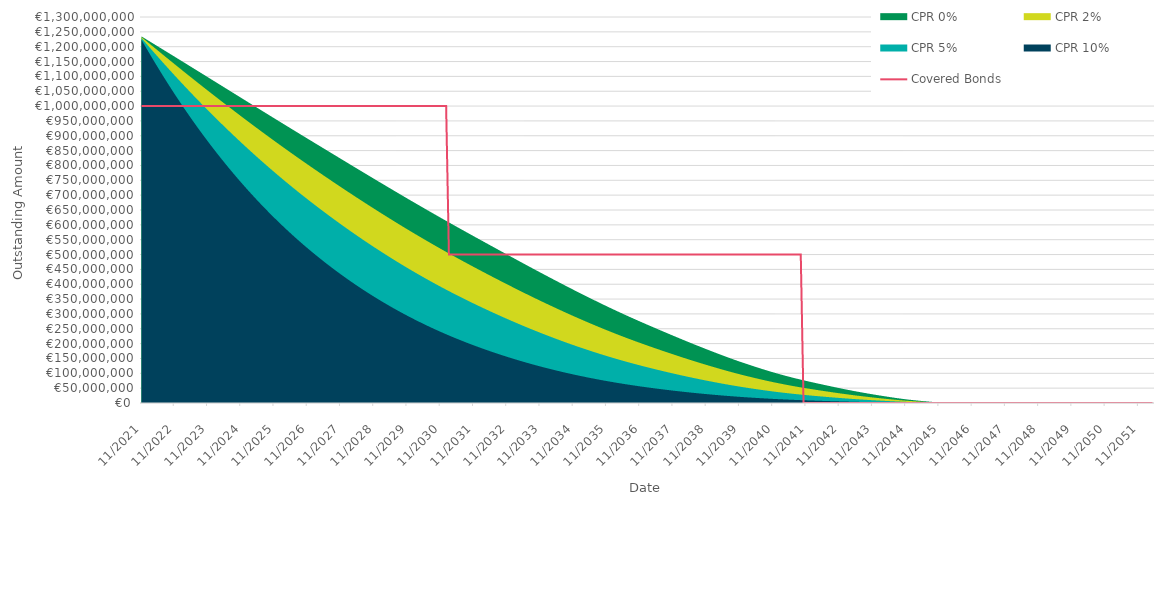
| Category | Covered Bonds |
|---|---|
| 2021-11-30 | 1000000000 |
| 2021-12-31 | 1000000000 |
| 2022-01-31 | 1000000000 |
| 2022-02-28 | 1000000000 |
| 2022-03-31 | 1000000000 |
| 2022-04-30 | 1000000000 |
| 2022-05-31 | 1000000000 |
| 2022-06-30 | 1000000000 |
| 2022-07-31 | 1000000000 |
| 2022-08-31 | 1000000000 |
| 2022-09-30 | 1000000000 |
| 2022-10-31 | 1000000000 |
| 2022-11-30 | 1000000000 |
| 2022-12-31 | 1000000000 |
| 2023-01-31 | 1000000000 |
| 2023-02-28 | 1000000000 |
| 2023-03-31 | 1000000000 |
| 2023-04-30 | 1000000000 |
| 2023-05-31 | 1000000000 |
| 2023-06-30 | 1000000000 |
| 2023-07-31 | 1000000000 |
| 2023-08-31 | 1000000000 |
| 2023-09-30 | 1000000000 |
| 2023-10-31 | 1000000000 |
| 2023-11-30 | 1000000000 |
| 2023-12-31 | 1000000000 |
| 2024-01-31 | 1000000000 |
| 2024-02-29 | 1000000000 |
| 2024-03-31 | 1000000000 |
| 2024-04-30 | 1000000000 |
| 2024-05-31 | 1000000000 |
| 2024-06-30 | 1000000000 |
| 2024-07-31 | 1000000000 |
| 2024-08-31 | 1000000000 |
| 2024-09-30 | 1000000000 |
| 2024-10-31 | 1000000000 |
| 2024-11-30 | 1000000000 |
| 2024-12-31 | 1000000000 |
| 2025-01-31 | 1000000000 |
| 2025-02-28 | 1000000000 |
| 2025-03-31 | 1000000000 |
| 2025-04-30 | 1000000000 |
| 2025-05-31 | 1000000000 |
| 2025-06-30 | 1000000000 |
| 2025-07-31 | 1000000000 |
| 2025-08-31 | 1000000000 |
| 2025-09-30 | 1000000000 |
| 2025-10-31 | 1000000000 |
| 2025-11-30 | 1000000000 |
| 2025-12-31 | 1000000000 |
| 2026-01-31 | 1000000000 |
| 2026-02-28 | 1000000000 |
| 2026-03-31 | 1000000000 |
| 2026-04-30 | 1000000000 |
| 2026-05-31 | 1000000000 |
| 2026-06-30 | 1000000000 |
| 2026-07-31 | 1000000000 |
| 2026-08-31 | 1000000000 |
| 2026-09-30 | 1000000000 |
| 2026-10-31 | 1000000000 |
| 2026-11-30 | 1000000000 |
| 2026-12-31 | 1000000000 |
| 2027-01-31 | 1000000000 |
| 2027-02-28 | 1000000000 |
| 2027-03-31 | 1000000000 |
| 2027-04-30 | 1000000000 |
| 2027-05-31 | 1000000000 |
| 2027-06-30 | 1000000000 |
| 2027-07-31 | 1000000000 |
| 2027-08-31 | 1000000000 |
| 2027-09-30 | 1000000000 |
| 2027-10-31 | 1000000000 |
| 2027-11-30 | 1000000000 |
| 2027-12-31 | 1000000000 |
| 2028-01-31 | 1000000000 |
| 2028-02-29 | 1000000000 |
| 2028-03-31 | 1000000000 |
| 2028-04-30 | 1000000000 |
| 2028-05-31 | 1000000000 |
| 2028-06-30 | 1000000000 |
| 2028-07-31 | 1000000000 |
| 2028-08-31 | 1000000000 |
| 2028-09-30 | 1000000000 |
| 2028-10-31 | 1000000000 |
| 2028-11-30 | 1000000000 |
| 2028-12-31 | 1000000000 |
| 2029-01-31 | 1000000000 |
| 2029-02-28 | 1000000000 |
| 2029-03-31 | 1000000000 |
| 2029-04-30 | 1000000000 |
| 2029-05-31 | 1000000000 |
| 2029-06-30 | 1000000000 |
| 2029-07-31 | 1000000000 |
| 2029-08-31 | 1000000000 |
| 2029-09-30 | 1000000000 |
| 2029-10-31 | 1000000000 |
| 2029-11-30 | 1000000000 |
| 2029-12-31 | 1000000000 |
| 2030-01-31 | 1000000000 |
| 2030-02-28 | 1000000000 |
| 2030-03-31 | 1000000000 |
| 2030-04-30 | 1000000000 |
| 2030-05-31 | 1000000000 |
| 2030-06-30 | 1000000000 |
| 2030-07-31 | 1000000000 |
| 2030-08-31 | 1000000000 |
| 2030-09-30 | 1000000000 |
| 2030-10-31 | 1000000000 |
| 2030-11-30 | 1000000000 |
| 2030-12-31 | 1000000000 |
| 2031-01-31 | 1000000000 |
| 2031-02-28 | 500000000 |
| 2031-03-31 | 500000000 |
| 2031-04-30 | 500000000 |
| 2031-05-31 | 500000000 |
| 2031-06-30 | 500000000 |
| 2031-07-31 | 500000000 |
| 2031-08-31 | 500000000 |
| 2031-09-30 | 500000000 |
| 2031-10-31 | 500000000 |
| 2031-11-30 | 500000000 |
| 2031-12-31 | 500000000 |
| 2032-01-31 | 500000000 |
| 2032-02-29 | 500000000 |
| 2032-03-31 | 500000000 |
| 2032-04-30 | 500000000 |
| 2032-05-31 | 500000000 |
| 2032-06-30 | 500000000 |
| 2032-07-31 | 500000000 |
| 2032-08-31 | 500000000 |
| 2032-09-30 | 500000000 |
| 2032-10-31 | 500000000 |
| 2032-11-30 | 500000000 |
| 2032-12-31 | 500000000 |
| 2033-01-31 | 500000000 |
| 2033-02-28 | 500000000 |
| 2033-03-31 | 500000000 |
| 2033-04-30 | 500000000 |
| 2033-05-31 | 500000000 |
| 2033-06-30 | 500000000 |
| 2033-07-31 | 500000000 |
| 2033-08-31 | 500000000 |
| 2033-09-30 | 500000000 |
| 2033-10-31 | 500000000 |
| 2033-11-30 | 500000000 |
| 2033-12-31 | 500000000 |
| 2034-01-31 | 500000000 |
| 2034-02-28 | 500000000 |
| 2034-03-31 | 500000000 |
| 2034-04-30 | 500000000 |
| 2034-05-31 | 500000000 |
| 2034-06-30 | 500000000 |
| 2034-07-31 | 500000000 |
| 2034-08-31 | 500000000 |
| 2034-09-30 | 500000000 |
| 2034-10-31 | 500000000 |
| 2034-11-30 | 500000000 |
| 2034-12-31 | 500000000 |
| 2035-01-31 | 500000000 |
| 2035-02-28 | 500000000 |
| 2035-03-31 | 500000000 |
| 2035-04-30 | 500000000 |
| 2035-05-31 | 500000000 |
| 2035-06-30 | 500000000 |
| 2035-07-31 | 500000000 |
| 2035-08-31 | 500000000 |
| 2035-09-30 | 500000000 |
| 2035-10-31 | 500000000 |
| 2035-11-30 | 500000000 |
| 2035-12-31 | 500000000 |
| 2036-01-31 | 500000000 |
| 2036-02-29 | 500000000 |
| 2036-03-31 | 500000000 |
| 2036-04-30 | 500000000 |
| 2036-05-31 | 500000000 |
| 2036-06-30 | 500000000 |
| 2036-07-31 | 500000000 |
| 2036-08-31 | 500000000 |
| 2036-09-30 | 500000000 |
| 2036-10-31 | 500000000 |
| 2036-11-30 | 500000000 |
| 2036-12-31 | 500000000 |
| 2037-01-31 | 500000000 |
| 2037-02-28 | 500000000 |
| 2037-03-31 | 500000000 |
| 2037-04-30 | 500000000 |
| 2037-05-31 | 500000000 |
| 2037-06-30 | 500000000 |
| 2037-07-31 | 500000000 |
| 2037-08-31 | 500000000 |
| 2037-09-30 | 500000000 |
| 2037-10-31 | 500000000 |
| 2037-11-30 | 500000000 |
| 2037-12-31 | 500000000 |
| 2038-01-31 | 500000000 |
| 2038-02-28 | 500000000 |
| 2038-03-31 | 500000000 |
| 2038-04-30 | 500000000 |
| 2038-05-31 | 500000000 |
| 2038-06-30 | 500000000 |
| 2038-07-31 | 500000000 |
| 2038-08-31 | 500000000 |
| 2038-09-30 | 500000000 |
| 2038-10-31 | 500000000 |
| 2038-11-30 | 500000000 |
| 2038-12-31 | 500000000 |
| 2039-01-31 | 500000000 |
| 2039-02-28 | 500000000 |
| 2039-03-31 | 500000000 |
| 2039-04-30 | 500000000 |
| 2039-05-31 | 500000000 |
| 2039-06-30 | 500000000 |
| 2039-07-31 | 500000000 |
| 2039-08-31 | 500000000 |
| 2039-09-30 | 500000000 |
| 2039-10-31 | 500000000 |
| 2039-11-30 | 500000000 |
| 2039-12-31 | 500000000 |
| 2040-01-31 | 500000000 |
| 2040-02-29 | 500000000 |
| 2040-03-31 | 500000000 |
| 2040-04-30 | 500000000 |
| 2040-05-31 | 500000000 |
| 2040-06-30 | 500000000 |
| 2040-07-31 | 500000000 |
| 2040-08-31 | 500000000 |
| 2040-09-30 | 500000000 |
| 2040-10-31 | 500000000 |
| 2040-11-30 | 500000000 |
| 2040-12-31 | 500000000 |
| 2041-01-31 | 500000000 |
| 2041-02-28 | 500000000 |
| 2041-03-31 | 500000000 |
| 2041-04-30 | 500000000 |
| 2041-05-31 | 500000000 |
| 2041-06-30 | 500000000 |
| 2041-07-31 | 500000000 |
| 2041-08-31 | 500000000 |
| 2041-09-30 | 500000000 |
| 2041-10-31 | 0 |
| 2041-11-30 | 0 |
| 2041-12-31 | 0 |
| 2042-01-31 | 0 |
| 2042-02-28 | 0 |
| 2042-03-31 | 0 |
| 2042-04-30 | 0 |
| 2042-05-31 | 0 |
| 2042-06-30 | 0 |
| 2042-07-31 | 0 |
| 2042-08-31 | 0 |
| 2042-09-30 | 0 |
| 2042-10-31 | 0 |
| 2042-11-30 | 0 |
| 2042-12-31 | 0 |
| 2043-01-31 | 0 |
| 2043-02-28 | 0 |
| 2043-03-31 | 0 |
| 2043-04-30 | 0 |
| 2043-05-31 | 0 |
| 2043-06-30 | 0 |
| 2043-07-31 | 0 |
| 2043-08-31 | 0 |
| 2043-09-30 | 0 |
| 2043-10-31 | 0 |
| 2043-11-30 | 0 |
| 2043-12-31 | 0 |
| 2044-01-31 | 0 |
| 2044-02-29 | 0 |
| 2044-03-31 | 0 |
| 2044-04-30 | 0 |
| 2044-05-31 | 0 |
| 2044-06-30 | 0 |
| 2044-07-31 | 0 |
| 2044-08-31 | 0 |
| 2044-09-30 | 0 |
| 2044-10-31 | 0 |
| 2044-11-30 | 0 |
| 2044-12-31 | 0 |
| 2045-01-31 | 0 |
| 2045-02-28 | 0 |
| 2045-03-31 | 0 |
| 2045-04-30 | 0 |
| 2045-05-31 | 0 |
| 2045-06-30 | 0 |
| 2045-07-31 | 0 |
| 2045-08-31 | 0 |
| 2045-09-30 | 0 |
| 2045-10-31 | 0 |
| 2045-11-30 | 0 |
| 2045-12-31 | 0 |
| 2046-01-31 | 0 |
| 2046-02-28 | 0 |
| 2046-03-31 | 0 |
| 2046-04-30 | 0 |
| 2046-05-31 | 0 |
| 2046-06-30 | 0 |
| 2046-07-31 | 0 |
| 2046-08-31 | 0 |
| 2046-09-30 | 0 |
| 2046-10-31 | 0 |
| 2046-11-30 | 0 |
| 2046-12-31 | 0 |
| 2047-01-31 | 0 |
| 2047-02-28 | 0 |
| 2047-03-31 | 0 |
| 2047-04-30 | 0 |
| 2047-05-31 | 0 |
| 2047-06-30 | 0 |
| 2047-07-31 | 0 |
| 2047-08-31 | 0 |
| 2047-09-30 | 0 |
| 2047-10-31 | 0 |
| 2047-11-30 | 0 |
| 2047-12-31 | 0 |
| 2048-01-31 | 0 |
| 2048-02-29 | 0 |
| 2048-03-31 | 0 |
| 2048-04-30 | 0 |
| 2048-05-31 | 0 |
| 2048-06-30 | 0 |
| 2048-07-31 | 0 |
| 2048-08-31 | 0 |
| 2048-09-30 | 0 |
| 2048-10-31 | 0 |
| 2048-11-30 | 0 |
| 2048-12-31 | 0 |
| 2049-01-31 | 0 |
| 2049-02-28 | 0 |
| 2049-03-31 | 0 |
| 2049-04-30 | 0 |
| 2049-05-31 | 0 |
| 2049-06-30 | 0 |
| 2049-07-31 | 0 |
| 2049-08-31 | 0 |
| 2049-09-30 | 0 |
| 2049-10-31 | 0 |
| 2049-11-30 | 0 |
| 2049-12-31 | 0 |
| 2050-01-31 | 0 |
| 2050-02-28 | 0 |
| 2050-03-31 | 0 |
| 2050-04-30 | 0 |
| 2050-05-31 | 0 |
| 2050-06-30 | 0 |
| 2050-07-31 | 0 |
| 2050-08-31 | 0 |
| 2050-09-30 | 0 |
| 2050-10-31 | 0 |
| 2050-11-30 | 0 |
| 2050-12-31 | 0 |
| 2051-01-31 | 0 |
| 2051-02-28 | 0 |
| 2051-03-31 | 0 |
| 2051-04-30 | 0 |
| 2051-05-31 | 0 |
| 2051-06-30 | 0 |
| 2051-07-31 | 0 |
| 2051-08-31 | 0 |
| 2051-09-30 | 0 |
| 2051-10-31 | 0 |
| 2051-11-30 | 0 |
| 2051-12-31 | 0 |
| 2052-01-31 | 0 |
| 2052-02-29 | 0 |
| 2052-03-31 | 0 |
| 2052-04-30 | 0 |